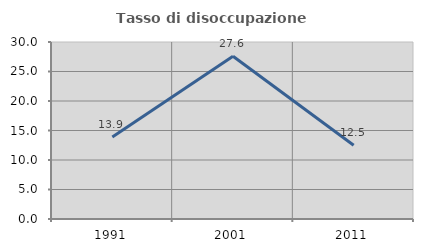
| Category | Tasso di disoccupazione giovanile  |
|---|---|
| 1991.0 | 13.889 |
| 2001.0 | 27.586 |
| 2011.0 | 12.5 |